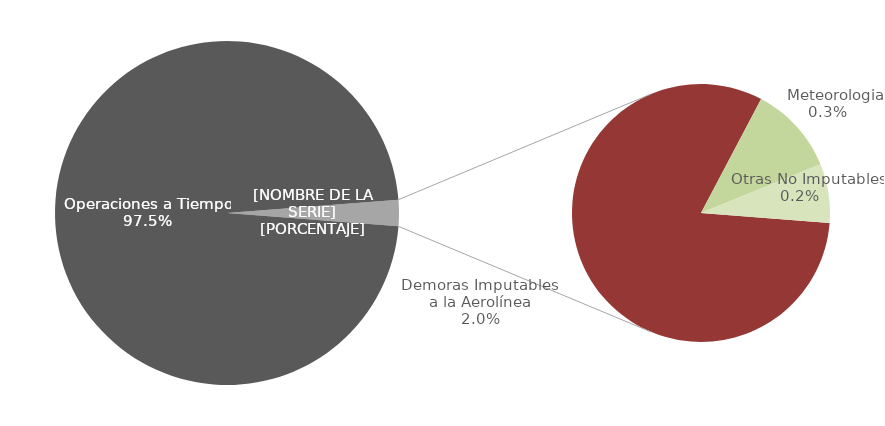
| Category | Demoras |
|---|---|
| Operaciones a Tiempo | 2128 |
| Demoras Imputables 
a la Aerolínea | 44 |
|    Aplicación de Control 
de Flujo | 0 |
|    Repercusiones por un 
Tercero | 0 |
|    Meteorologia | 6 |
|    Otras No Imputables | 4 |